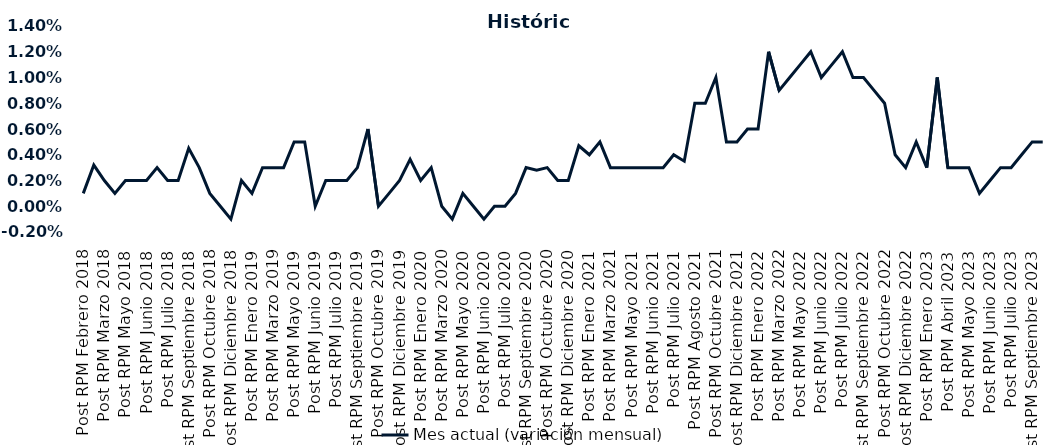
| Category | Mes actual (variación mensual)  |
|---|---|
| Post RPM Febrero 2018 | 0.001 |
| Pre RPM Marzo 2018 | 0.003 |
| Post RPM Marzo 2018 | 0.002 |
| Pre RPM Mayo 2018 | 0.001 |
| Post RPM Mayo 2018 | 0.002 |
| Pre RPM Junio 2018 | 0.002 |
| Post RPM Junio 2018 | 0.002 |
| Pre RPM Julio 2018 | 0.003 |
| Post RPM Julio 2018 | 0.002 |
| Pre RPM Septiembre 2018 | 0.002 |
| Post RPM Septiembre 2018 | 0.004 |
| Pre RPM Octubre 2018 | 0.003 |
| Post RPM Octubre 2018 | 0.001 |
| Pre RPM Diciembre 2018 | 0 |
| Post RPM Diciembre 2018 | -0.001 |
| Pre RPM Enero 2019 | 0.002 |
| Post RPM Enero 2019 | 0.001 |
| Pre RPM Marzo 2019 | 0.003 |
| Post RPM Marzo 2019 | 0.003 |
| Pre RPM Mayo 2019 | 0.003 |
| Post RPM Mayo 2019 | 0.005 |
| Pre RPM Junio 2019 | 0.005 |
| Post RPM Junio 2019 | 0 |
| Pre RPM Julio 2019 | 0.002 |
| Post RPM Julio 2019 | 0.002 |
| Pre RPM Septiembre 2019 | 0.002 |
| Post RPM Septiembre 2019 | 0.003 |
| Pre RPM Octubre 2019 | 0.006 |
| Post RPM Octubre 2019 | 0 |
| Pre RPM Diciembre 2019 | 0.001 |
| Post RPM Diciembre 2019 | 0.002 |
| Pre RPM Enero 2020 | 0.004 |
| Post RPM Enero 2020 | 0.002 |
| Pre RPM Marzo 2020 | 0.003 |
| Post RPM Marzo 2020 | 0 |
| Pre RPM Mayo 2020 | -0.001 |
| Post RPM Mayo 2020 | 0.001 |
| Pre RPM Junio 2020 | 0 |
| Post RPM Junio 2020 | -0.001 |
| Pre RPM Julio 2020 | 0 |
| Post RPM Julio 2020 | 0 |
| Pre RPM Septiembre 2020 | 0.001 |
| Post RPM Septiembre 2020 | 0.003 |
| Pre RPM Octubre 2020 | 0.003 |
| Post RPM Octubre 2020 | 0.003 |
| Pre RPM Diciembre 2020 | 0.002 |
| Post RPM Diciembre 2020 | 0.002 |
| Pre RPM Enero 2021 | 0.005 |
| Post RPM Enero 2021 | 0.004 |
| Pre RPM Marzo 2021 | 0.005 |
| Post RPM Marzo 2021 | 0.003 |
| Pre RPM Mayo 2021 | 0.003 |
| Post RPM Mayo 2021 | 0.003 |
| Pre RPM Junio 2021 | 0.003 |
| Post RPM Junio 2021 | 0.003 |
| Pre RPM Julio 2021 | 0.003 |
| Post RPM Julio 2021 | 0.004 |
| Pre RPM Agosto 2021 | 0.004 |
| Post RPM Agosto 2021 | 0.008 |
| Pre RPM Octubre 2021 | 0.008 |
| Post RPM Octubre 2021 | 0.01 |
| Pre RPM Diciembre 2021 | 0.005 |
| Post RPM Diciembre 2021 | 0.005 |
| Pre RPM Enero 2022 | 0.006 |
| Post RPM Enero 2022 | 0.006 |
| Pre RPM Marzo 2022 | 0.012 |
| Post RPM Marzo 2022 | 0.009 |
| Pre RPM Mayo 2022 | 0.01 |
| Post RPM Mayo 2022 | 0.011 |
| Pre RPM Junio 2022 | 0.012 |
| Post RPM Junio 2022 | 0.01 |
| Pre RPM Julio 2022 | 0.011 |
| Post RPM Julio 2022 | 0.012 |
| Pre RPM Septiembre 2022 | 0.01 |
| Post RPM Septiembre 2022 | 0.01 |
| Pre RPM Octubre 2022 | 0.009 |
| Post RPM Octubre 2022 | 0.008 |
| Pre RPM Diciembre 2022 | 0.004 |
| Post RPM Diciembre 2022 | 0.003 |
| Pre RPM Enero 2023 | 0.005 |
| Post RPM Enero 2023 | 0.003 |
| Pre RPM Abril 2023 | 0.01 |
| Post RPM Abril 2023 | 0.003 |
| Pre RPM Mayo 2023 | 0.003 |
| Post RPM Mayo 2023 | 0.003 |
| Pre RPM Junio 2023 | 0.001 |
| Post RPM Junio 2023 | 0.002 |
| Pre RPM Julio 2023 | 0.003 |
| Post RPM Julio 2023 | 0.003 |
| Pre RPM Septiembre 2023 | 0.004 |
| Post RPM Septiembre 2023 | 0.005 |
| Pre RPM Octubre 2023 | 0.005 |